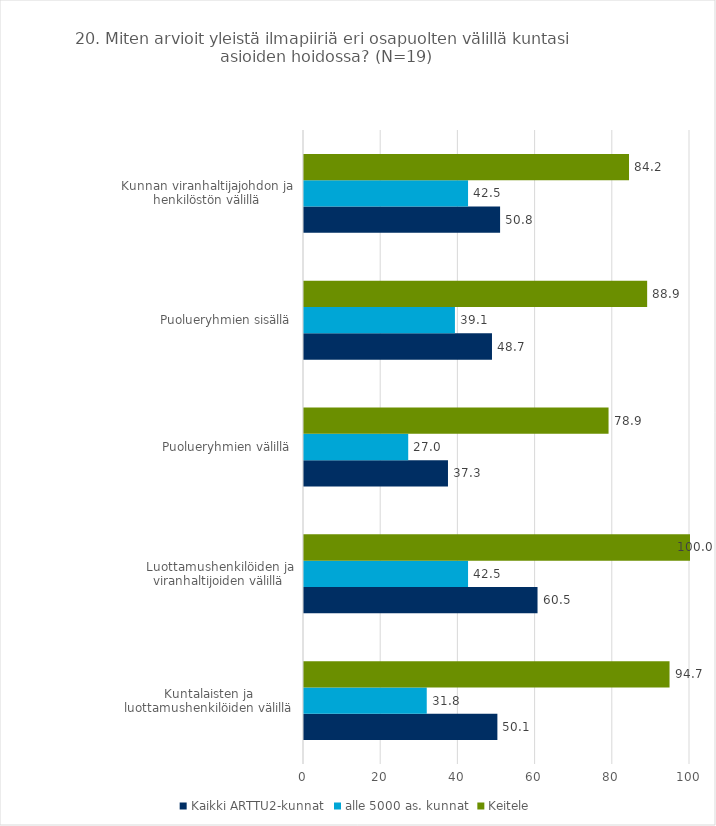
| Category | Kaikki ARTTU2-kunnat | alle 5000 as. kunnat | Keitele |
|---|---|---|---|
| Kuntalaisten ja luottamushenkilöiden välillä | 50.1 | 31.8 | 94.7 |
| Luottamushenkilöiden ja viranhaltijoiden välillä | 60.5 | 42.5 | 100 |
| Puolueryhmien välillä | 37.3 | 27 | 78.9 |
| Puolueryhmien sisällä | 48.7 | 39.1 | 88.9 |
| Kunnan viranhaltijajohdon ja henkilöstön välillä | 50.8 | 42.5 | 84.2 |